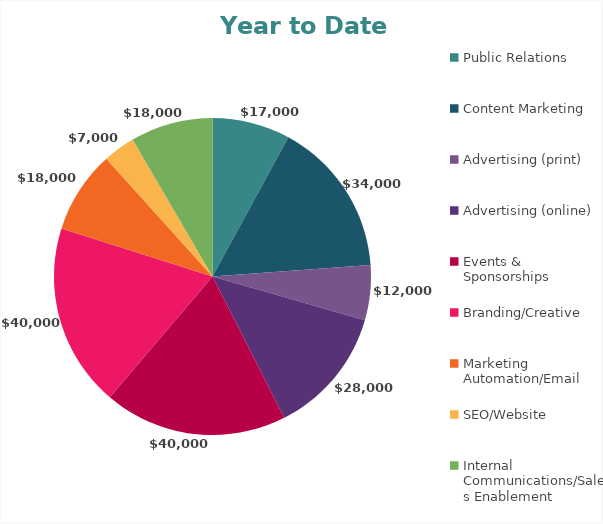
| Category | Series 0 |
|---|---|
| Public Relations | 17000 |
| Content Marketing | 34000 |
| Advertising (print) | 12000 |
| Advertising (online) | 28000 |
| Events & Sponsorships | 40000 |
| Branding/Creative | 40000 |
| Marketing Automation/Email | 18000 |
| SEO/Website | 7000 |
| Internal Communications/Sales Enablement | 18000 |